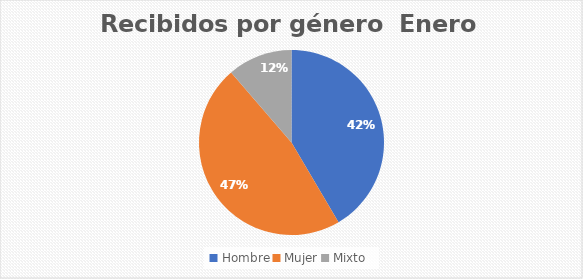
| Category | Recibidos por género  Enero |
|---|---|
| Hombre | 22 |
| Mujer | 25 |
| Mixto | 6 |